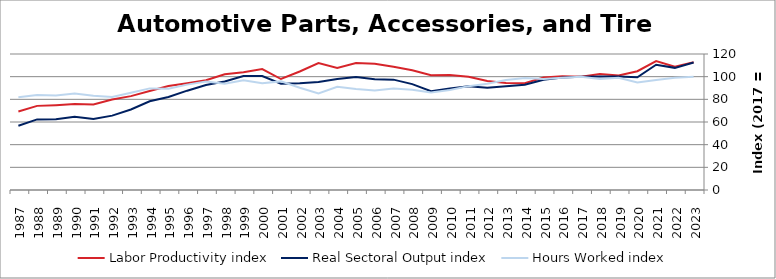
| Category | Labor Productivity index | Real Sectoral Output index | Hours Worked index |
|---|---|---|---|
| 2023.0 | 112.68 | 112.483 | 99.825 |
| 2022.0 | 108.718 | 107.774 | 99.132 |
| 2021.0 | 113.823 | 110.557 | 97.13 |
| 2020.0 | 104.819 | 99.402 | 94.832 |
| 2019.0 | 101.077 | 100.055 | 98.989 |
| 2018.0 | 102.325 | 100.219 | 97.942 |
| 2017.0 | 100 | 100 | 100 |
| 2016.0 | 100.335 | 99.354 | 99.022 |
| 2015.0 | 99.312 | 97.209 | 97.882 |
| 2014.0 | 94.125 | 92.95 | 98.752 |
| 2013.0 | 94.416 | 91.621 | 97.04 |
| 2012.0 | 96.27 | 90.207 | 93.702 |
| 2011.0 | 99.916 | 91.566 | 91.643 |
| 2010.0 | 101.497 | 89.592 | 88.27 |
| 2009.0 | 101.317 | 87.107 | 85.974 |
| 2008.0 | 105.696 | 93.444 | 88.408 |
| 2007.0 | 108.742 | 97.367 | 89.54 |
| 2006.0 | 111.482 | 97.827 | 87.752 |
| 2005.0 | 111.996 | 99.733 | 89.05 |
| 2004.0 | 107.586 | 97.971 | 91.063 |
| 2003.0 | 111.941 | 95.333 | 85.164 |
| 2002.0 | 104.55 | 94.261 | 90.159 |
| 2001.0 | 97.931 | 93.852 | 95.834 |
| 2000.0 | 106.732 | 100.507 | 94.168 |
| 1999.0 | 103.898 | 100.502 | 96.731 |
| 1998.0 | 102.127 | 95.804 | 93.809 |
| 1997.0 | 96.804 | 92.665 | 95.725 |
| 1996.0 | 94.27 | 87.643 | 92.971 |
| 1995.0 | 91.766 | 82.001 | 89.358 |
| 1994.0 | 87.277 | 78.255 | 89.662 |
| 1993.0 | 82.822 | 71.015 | 85.744 |
| 1992.0 | 79.911 | 65.632 | 82.131 |
| 1991.0 | 75.411 | 62.652 | 83.081 |
| 1990.0 | 75.838 | 64.629 | 85.22 |
| 1989.0 | 74.884 | 62.49 | 83.45 |
| 1988.0 | 74.232 | 62.277 | 83.895 |
| 1987.0 | 69.199 | 56.634 | 81.843 |